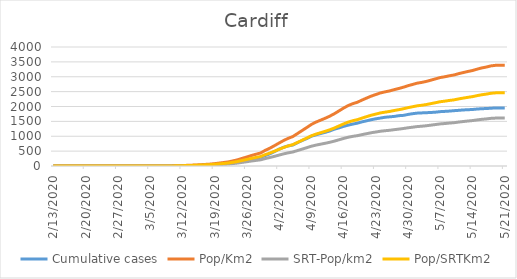
| Category | Cumulative cases | Pop/Km2 | SRT-Pop/km2 | Pop/SRTKm2 |
|---|---|---|---|---|
| 5/21/20 | 1953 | 3384.38 | 1610.462 | 2458.952 |
| 5/20/20 | 1953 | 3384.38 | 1610.462 | 2458.952 |
| 5/19/20 | 1953 | 3383.585 | 1610.083 | 2458.374 |
| 5/18/20 | 1941 | 3365.034 | 1601.256 | 2444.896 |
| 5/17/20 | 1932 | 3325.549 | 1582.467 | 2416.207 |
| 5/16/20 | 1925 | 3296.133 | 1568.469 | 2394.835 |
| 5/15/20 | 1915 | 3254.792 | 1548.797 | 2364.799 |
| 5/14/20 | 1899 | 3208.946 | 1526.981 | 2331.489 |
| 5/13/20 | 1892 | 3177.146 | 1511.849 | 2308.384 |
| 5/12/20 | 1884 | 3140.575 | 1494.447 | 2281.813 |
| 5/11/20 | 1871 | 3104.269 | 1477.171 | 2255.435 |
| 5/10/20 | 1860 | 3059.219 | 1455.733 | 2222.703 |
| 5/9/20 | 1846 | 3032.983 | 1443.249 | 2203.641 |
| 5/8/20 | 1836 | 3000.122 | 1427.612 | 2179.766 |
| 5/7/20 | 1827 | 2973.622 | 1415.002 | 2160.512 |
| 5/6/20 | 1810 | 2929.896 | 1394.195 | 2128.742 |
| 5/5/20 | 1799 | 2886.17 | 1373.388 | 2096.973 |
| 5/4/20 | 1792 | 2844.034 | 1353.338 | 2066.359 |
| 5/3/20 | 1785 | 2810.114 | 1337.196 | 2041.714 |
| 5/2/20 | 1777 | 2785.203 | 1325.343 | 2023.615 |
| 5/1/20 | 1758 | 2740.947 | 1304.283 | 1991.46 |
| 4/30/20 | 1733 | 2699.077 | 1284.359 | 1961.039 |
| 4/29/20 | 1702 | 2648.196 | 1260.147 | 1924.071 |
| 4/28/20 | 1691 | 2605 | 1239.593 | 1892.686 |
| 4/27/20 | 1666 | 2566.309 | 1221.182 | 1864.575 |
| 4/26/20 | 1652 | 2522.848 | 1200.501 | 1832.998 |
| 4/25/20 | 1638 | 2491.313 | 1185.494 | 1810.086 |
| 4/24/20 | 1611 | 2455.537 | 1168.471 | 1784.093 |
| 4/23/20 | 1586 | 2400.681 | 1142.367 | 1744.236 |
| 4/22/20 | 1555 | 2348.21 | 1117.399 | 1706.113 |
| 4/21/20 | 1518 | 2281.694 | 1085.747 | 1657.785 |
| 4/20/20 | 1483 | 2214.647 | 1053.843 | 1609.072 |
| 4/19/20 | 1439 | 2141.771 | 1019.165 | 1556.123 |
| 4/18/20 | 1409 | 2094.6 | 996.718 | 1521.851 |
| 4/17/20 | 1372 | 2030.204 | 966.075 | 1475.063 |
| 4/16/20 | 1331 | 1944.872 | 925.47 | 1413.064 |
| 4/15/20 | 1281 | 1849.735 | 880.199 | 1343.942 |
| 4/14/20 | 1236 | 1755.659 | 835.432 | 1275.59 |
| 4/13/20 | 1176 | 1673.507 | 796.341 | 1215.902 |
| 4/12/20 | 1130 | 1602.751 | 762.671 | 1164.493 |
| 4/11/20 | 1090 | 1538.354 | 732.028 | 1117.705 |
| 4/10/20 | 1046 | 1473.693 | 701.259 | 1070.725 |
| 4/9/20 | 999 | 1394.192 | 663.428 | 1012.963 |
| 4/8/20 | 920 | 1290.84 | 614.248 | 937.871 |
| 4/7/20 | 856 | 1189.343 | 565.95 | 864.128 |
| 4/6/20 | 781 | 1089.701 | 518.536 | 791.732 |
| 4/5/20 | 704 | 989.264 | 470.743 | 718.759 |
| 4/4/20 | 675 | 930.698 | 442.874 | 676.207 |
| 4/3/20 | 629 | 856.231 | 407.439 | 622.103 |
| 4/2/20 | 565 | 770.37 | 366.581 | 559.719 |
| 4/1/20 | 481 | 682.123 | 324.589 | 495.603 |
| 3/31/20 | 409 | 597.321 | 284.236 | 433.989 |
| 3/30/20 | 350 | 525.505 | 250.062 | 381.81 |
| 3/29/20 | 295 | 436.993 | 207.944 | 317.501 |
| 3/28/20 | 266 | 395.653 | 188.272 | 287.465 |
| 3/27/20 | 227 | 351.662 | 167.339 | 255.503 |
| 3/26/20 | 194 | 302.636 | 144.01 | 219.883 |
| 3/25/20 | 159 | 256.525 | 122.068 | 186.38 |
| 3/24/20 | 130 | 208.029 | 98.991 | 151.145 |
| 3/23/20 | 111 | 172.253 | 81.967 | 125.152 |
| 3/22/20 | 86 | 137.803 | 65.574 | 100.122 |
| 3/21/20 | 75 | 117.662 | 55.99 | 85.489 |
| 3/20/20 | 62 | 97.787 | 46.532 | 71.048 |
| 3/19/20 | 51 | 78.707 | 37.453 | 57.185 |
| 3/18/20 | 36 | 62.806 | 29.886 | 45.632 |
| 3/17/20 | 29 | 53.531 | 25.473 | 38.893 |
| 3/16/20 | 18 | 43.726 | 20.807 | 31.769 |
| 3/15/20 | 14 | 34.716 | 16.519 | 25.223 |
| 3/14/20 | 8 | 27.031 | 12.863 | 19.639 |
| 3/13/20 | 4 | 21.995 | 10.467 | 15.981 |
| 3/12/20 | 4 | 14.84 | 7.062 | 10.782 |
| 3/11/20 | 3 | 8.48 | 4.035 | 6.161 |
| 3/10/20 | 2 | 4.77 | 2.27 | 3.466 |
| 3/9/20 | 2 | 1.855 | 0.883 | 1.348 |
| 3/8/20 | 1 | 1.06 | 0.504 | 0.77 |
| 3/7/20 | 1 | 1.06 | 0.504 | 0.77 |
| 3/6/20 | 1 | 0.53 | 0.252 | 0.385 |
| 3/5/20 | 1 | 0.53 | 0.252 | 0.385 |
| 3/4/20 | 1 | 0.53 | 0.252 | 0.385 |
| 3/3/20 | 0 | 0.265 | 0.126 | 0.193 |
| 3/2/20 | 0 | 0.265 | 0.126 | 0.193 |
| 3/1/20 | 0 | 0.265 | 0.126 | 0.193 |
| 2/29/20 | 0 | 0.265 | 0.126 | 0.193 |
| 2/28/20 | 0 | 0.265 | 0.126 | 0.193 |
| 2/27/20 | 0 | 0.265 | 0.126 | 0.193 |
| 2/26/20 | 0 | 0 | 0 | 0 |
| 2/25/20 | 0 | 0 | 0 | 0 |
| 2/24/20 | 0 | 0 | 0 | 0 |
| 2/23/20 | 0 | 0 | 0 | 0 |
| 2/22/20 | 0 | 0 | 0 | 0 |
| 2/21/20 | 0 | 0 | 0 | 0 |
| 2/20/20 | 0 | 0 | 0 | 0 |
| 2/19/20 | 0 | 0 | 0 | 0 |
| 2/18/20 | 0 | 0 | 0 | 0 |
| 2/17/20 | 0 | 0 | 0 | 0 |
| 2/16/20 | 0 | 0 | 0 | 0 |
| 2/15/20 | 0 | 0 | 0 | 0 |
| 2/14/20 | 0 | 0 | 0 | 0 |
| 2/13/20 | 0 | 0 | 0 | 0 |